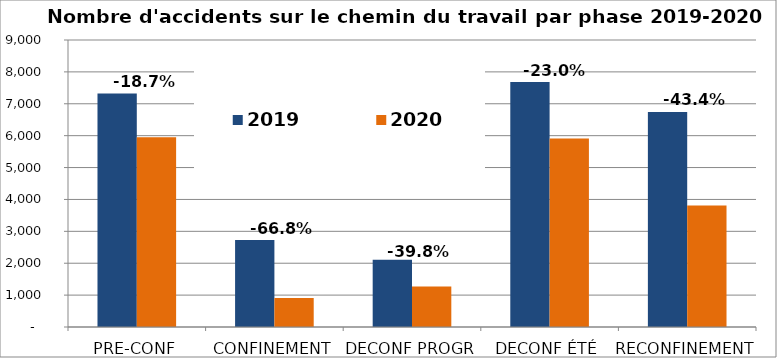
| Category | 2019 | 2020 |
|---|---|---|
| PRE-CONF | 7319 | 5949 |
| CONFINEMENT | 2729 | 906 |
| DECONF PROGR | 2105 | 1267 |
| DECONF ÉTÉ | 7682 | 5913 |
| RECONFINEMENT | 6744 | 3814 |